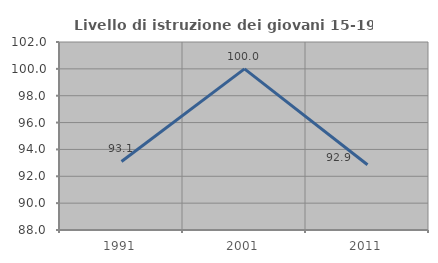
| Category | Livello di istruzione dei giovani 15-19 anni |
|---|---|
| 1991.0 | 93.103 |
| 2001.0 | 100 |
| 2011.0 | 92.857 |